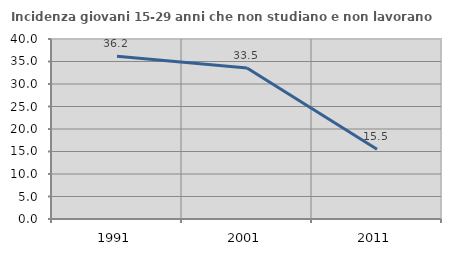
| Category | Incidenza giovani 15-29 anni che non studiano e non lavorano  |
|---|---|
| 1991.0 | 36.156 |
| 2001.0 | 33.54 |
| 2011.0 | 15.493 |